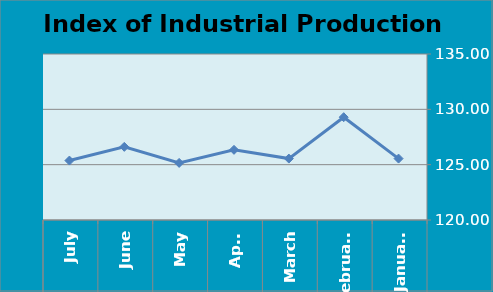
| Category | Series 0 |
|---|---|
| 0 | 125.55 |
| 1 | 129.29 |
| 2 | 125.55 |
| 3 | 126.34 |
| 4 | 125.16 |
| 5 | 126.61 |
| 6 | 125.37 |